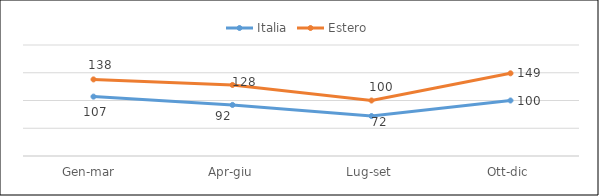
| Category | Italia | Estero |
|---|---|---|
| Gen-mar  | 107 | 138 |
| Apr-giu | 92 | 128 |
| Lug-set | 72 | 100 |
| Ott-dic | 100 | 149 |